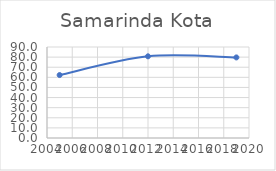
| Category | Series 0 |
|---|---|
| 2005.0 | 62.258 |
| 2012.0 | 80.785 |
| 2019.0 | 79.693 |